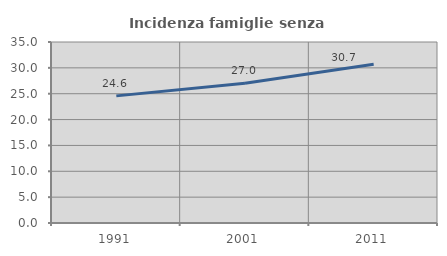
| Category | Incidenza famiglie senza nuclei |
|---|---|
| 1991.0 | 24.581 |
| 2001.0 | 27.004 |
| 2011.0 | 30.681 |